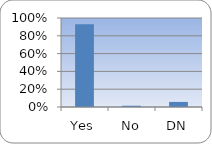
| Category | Series 0 |
|---|---|
| Yes | 0.929 |
| No | 0.014 |
| DN | 0.057 |